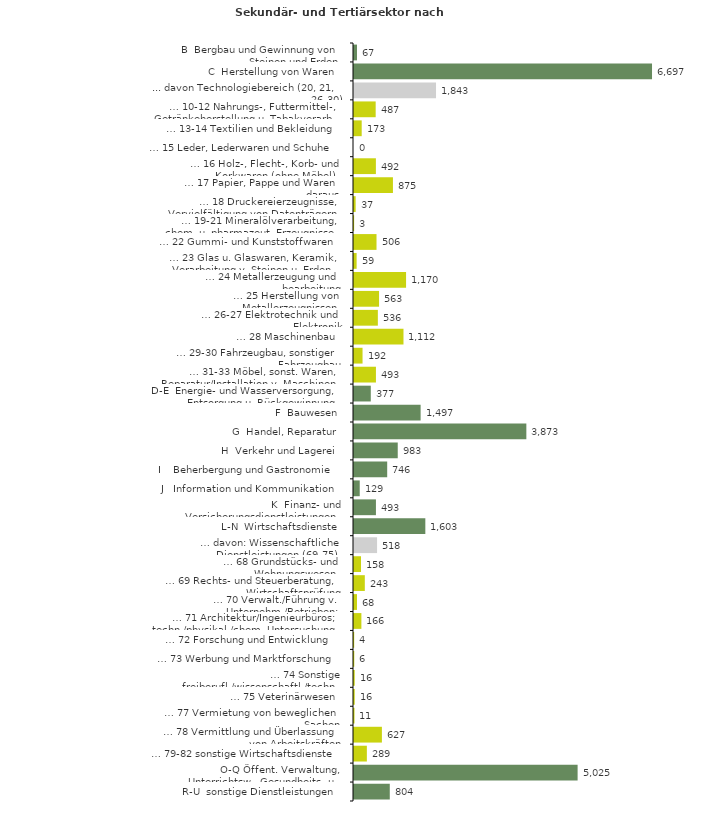
| Category | Series 0 |
|---|---|
| B  Bergbau und Gewinnung von Steinen und Erden | 67 |
| C  Herstellung von Waren | 6697 |
| ... davon Technologiebereich (20, 21, 26-30) | 1843 |
| … 10-12 Nahrungs-, Futtermittel-, Getränkeherstellung u. Tabakverarb. | 487 |
| … 13-14 Textilien und Bekleidung | 173 |
| … 15 Leder, Lederwaren und Schuhe | 0 |
| … 16 Holz-, Flecht-, Korb- und Korkwaren (ohne Möbel)  | 492 |
| … 17 Papier, Pappe und Waren daraus  | 875 |
| … 18 Druckereierzeugnisse, Vervielfältigung von Datenträgern | 37 |
| … 19-21 Mineralölverarbeitung, chem. u. pharmazeut. Erzeugnisse | 3 |
| … 22 Gummi- und Kunststoffwaren | 506 |
| … 23 Glas u. Glaswaren, Keramik, Verarbeitung v. Steinen u. Erden  | 59 |
| … 24 Metallerzeugung und -bearbeitung | 1170 |
| … 25 Herstellung von Metallerzeugnissen  | 563 |
| … 26-27 Elektrotechnik und Elektronik | 536 |
| … 28 Maschinenbau | 1112 |
| … 29-30 Fahrzeugbau, sonstiger Fahrzeugbau | 192 |
| … 31-33 Möbel, sonst. Waren, Reparatur/Installation v. Maschinen | 493 |
| D-E  Energie- und Wasserversorgung, Entsorgung u. Rückgewinnung | 377 |
| F  Bauwesen | 1497 |
| G  Handel, Reparatur | 3873 |
| H  Verkehr und Lagerei | 983 |
| I    Beherbergung und Gastronomie | 746 |
| J   Information und Kommunikation | 129 |
| K  Finanz- und Versicherungsdienstleistungen | 493 |
| L-N  Wirtschaftsdienste | 1603 |
| … davon: Wissenschaftliche Dienstleistungen (69-75) | 518 |
| … 68 Grundstücks- und Wohnungswesen  | 158 |
| … 69 Rechts- und Steuerberatung, Wirtschaftsprüfung | 243 |
| … 70 Verwalt./Führung v. Unternehm./Betrieben; Unternehmensberat. | 68 |
| … 71 Architektur/Ingenieurbüros; techn./physikal./chem. Untersuchung | 166 |
| … 72 Forschung und Entwicklung  | 4 |
| … 73 Werbung und Marktforschung | 6 |
| … 74 Sonstige freiberufl./wissenschaftl./techn. Tätigkeiten | 16 |
| … 75 Veterinärwesen | 16 |
| … 77 Vermietung von beweglichen Sachen  | 11 |
| … 78 Vermittlung und Überlassung von Arbeitskräften | 627 |
| … 79-82 sonstige Wirtschaftsdienste | 289 |
| O-Q Öffent. Verwaltung, Unterrichtsw., Gesundheits- u. Sozialwesen | 5025 |
| R-U  sonstige Dienstleistungen | 804 |